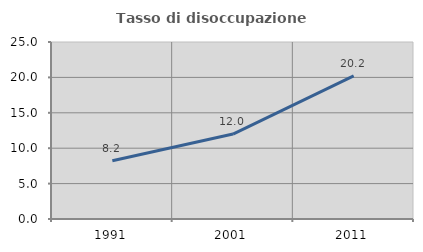
| Category | Tasso di disoccupazione giovanile  |
|---|---|
| 1991.0 | 8.228 |
| 2001.0 | 12 |
| 2011.0 | 20.213 |